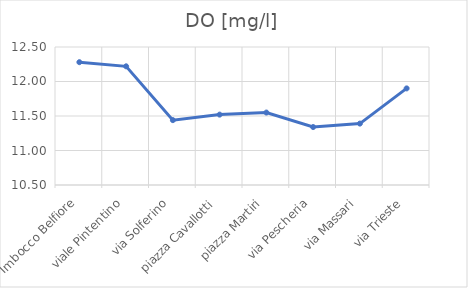
| Category | DO [mg/l] |
|---|---|
| Imbocco Belfiore | 12.28 |
| viale Pintentino | 12.22 |
| via Solferino | 11.44 |
| piazza Cavallotti | 11.52 |
| piazza Martiri | 11.55 |
| via Pescheria | 11.34 |
| via Massari | 11.39 |
| via Trieste | 11.9 |